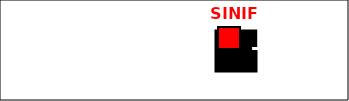
| Category | Series 0 | Series 1 | Series 2 |
|---|---|---|---|
| 0 | 0 |  |  |
| 1 | 0 |  |  |